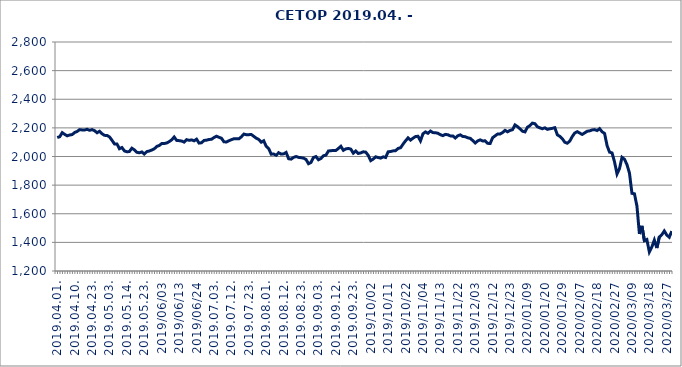
| Category | CETOP |
|---|---|
| 2019.04.01. | 2132.574 |
| 2019.04.02. | 2138.374 |
| 2019.04.03. | 2166.651 |
| 2019.04.04. | 2154.718 |
| 2019.04.05. | 2144.455 |
| 2019.04.08. | 2150.202 |
| 2019.04.09. | 2153.045 |
| 2019.04.10. | 2167.895 |
| 2019.04.11. | 2174.854 |
| 2019.04.12. | 2187.792 |
| 2019.04.15. | 2185.484 |
| 2019.04.16. | 2185.305 |
| 2019.04.17. | 2190.201 |
| 2019.04.18. | 2182.992 |
| 2019.04.23. | 2187.796 |
| 2019.04.24. | 2180.508 |
| 2019.04.25. | 2165.991 |
| 2019.04.26. | 2176.261 |
| 2019.04.29. | 2159.18 |
| 2019.04.30. | 2147.64 |
| 2019.05.02. | 2147.386 |
| 2019.05.03. | 2136.927 |
| 2019.05.06. | 2113.432 |
| 2019.05.07. | 2087.889 |
| 2019.05.08. | 2087.837 |
| 2019.05.09. | 2054.158 |
| 2019.05.10. | 2062.71 |
| 2019.05.13. | 2038.936 |
| 2019.05.14. | 2033.011 |
| 2019.05.15. | 2034.809 |
| 2019.05.16. | 2058.039 |
| 2019.05.17. | 2046.341 |
| 2019.05.20. | 2029.475 |
| 2019.05.21. | 2025.854 |
| 2019.05.22. | 2032.113 |
| 2019.05.23. | 2017.154 |
| 2019.05.24. | 2034.381 |
| 2019.05.27. | 2038.296 |
| 2019.05.28. | 2045.236 |
| 2019.05.29. | 2053.447 |
| 2019.05.30. | 2070.528 |
| 2019.05.31. | 2076.617 |
| 2019.06.03 | 2090.394 |
| 2019.06.04 | 2090.6 |
| 2019.06.05 | 2094.513 |
| 2019.06.06 | 2103.91 |
| 2019.06.07 | 2116.435 |
| 2019.06.11 | 2136.123 |
| 2019.06.12 | 2112.388 |
| 2019.06.13 | 2110.676 |
| 2019.06.14 | 2108.209 |
| 2019.06.17 | 2100.6 |
| 2019.06.18 | 2117.572 |
| 2019.06.19 | 2113.011 |
| 2019.06.20 | 2115.984 |
| 2019.06.21 | 2109.609 |
| 2019.06.24 | 2120.999 |
| 2019.06.25 | 2093.746 |
| 2019.06.26 | 2096.039 |
| 2019.06.27 | 2112.207 |
| 2019.06.28 | 2113.97 |
| 2019.07.01. | 2119.044 |
| 2019.07.02. | 2120.3 |
| 2019.07.03. | 2132.465 |
| 2019.07.04. | 2141.695 |
| 2019.07.05. | 2134.196 |
| 2019.07.08. | 2127.836 |
| 2019.07.09. | 2102.643 |
| 2019.07.10. | 2101.454 |
| 2019.07.11. | 2110.086 |
| 2019.07.12. | 2117.39 |
| 2019.07.15. | 2123.898 |
| 2019.07.16. | 2124.809 |
| 2019.07.17. | 2123.353 |
| 2019.07.18. | 2137.452 |
| 2019.07.19. | 2156.668 |
| 2019.07.22. | 2152.36 |
| 2019.07.23. | 2152.57 |
| 2019.07.24. | 2153.612 |
| 2019.07.25. | 2140.737 |
| 2019.07.26. | 2127.816 |
| 2019.07.29. | 2118.782 |
| 2019.07.30. | 2099.886 |
| 2019.07.31. | 2109.818 |
| 2019.08.01. | 2070.93 |
| 2019.08.02. | 2055.032 |
| 2019.08.05. | 2016.276 |
| 2019.08.06. | 2017.506 |
| 2019.08.07. | 2008.979 |
| 2019.08.08. | 2026.532 |
| 2019.08.09. | 2016.695 |
| 2019.08.12. | 2018.423 |
| 2019.08.13. | 2028.416 |
| 2019.08.14. | 1984.487 |
| 2019.08.15. | 1981.724 |
| 2019.08.16. | 1993.713 |
| 2019.08.21. | 2000.188 |
| 2019.08.22. | 1993.951 |
| 2019.08.23. | 1991.843 |
| 2019.08.26. | 1988.713 |
| 2019.08.27. | 1979.26 |
| 2019.08.28. | 1949.461 |
| 2019.08.29. | 1958.413 |
| 2019.08.30. | 1993.113 |
| 2019.09.02. | 1999.57 |
| 2019.09.03. | 1977.184 |
| 2019.09.04. | 1986.239 |
| 2019.09.05. | 2005.325 |
| 2019.09.06. | 2009.588 |
| 2019.09.09. | 2038.644 |
| 2019.09.10. | 2040.218 |
| 2019.09.11. | 2042.754 |
| 2019.09.12. | 2042.339 |
| 2019.09.13. | 2056.076 |
| 2019.09.16. | 2071.224 |
| 2019.09.17. | 2043.022 |
| 2019.09.18. | 2053.353 |
| 2019.09.19. | 2056.136 |
| 2019.09.20. | 2051.549 |
| 2019.09.23. | 2023.377 |
| 2019.09.24. | 2038.404 |
| 2019.09.25. | 2021.298 |
| 2019.09.26. | 2025.245 |
| 2019.09.27. | 2032.833 |
| 2019.09.30. | 2030.463 |
| 2019.10.01 | 2008.057 |
| 2019.10.02 | 1971.078 |
| 2019.10.03 | 1981.991 |
| 2019.10.04 | 1997.58 |
| 2019.10.07 | 1992.692 |
| 2019.10.08 | 1988.823 |
| 2019.10.09 | 1997.733 |
| 2019.10.10 | 1992.922 |
| 2019.10.11 | 2032.773 |
| 2019.10.14 | 2034.801 |
| 2019.10.15 | 2039.197 |
| 2019.10.16 | 2040.819 |
| 2019.10.17 | 2056.4 |
| 2019.10.18 | 2061.182 |
| 2019.10.21 | 2086.559 |
| 2019.10.22 | 2109.527 |
| 2019.10.24 | 2130.228 |
| 2019.10.25 | 2114.565 |
| 2019.10.28 | 2128.02 |
| 2019.10.29 | 2139.266 |
| 2019.10.30 | 2141.575 |
| 2019.10.31 | 2109.221 |
| 2019.11.04 | 2158.943 |
| 2019.11.05 | 2171.721 |
| 2019.11.06 | 2162.076 |
| 2019.11.07 | 2177.859 |
| 2019.11.08 | 2166.914 |
| 2019.11.11 | 2166.351 |
| 2019.11.12 | 2162.246 |
| 2019.11.13 | 2152.526 |
| 2019.11.14 | 2145.406 |
| 2019.11.15 | 2154.38 |
| 2019.11.18 | 2151.842 |
| 2019.11.19 | 2143.897 |
| 2019.11.20 | 2143.72 |
| 2019.11.21 | 2129.171 |
| 2019.11.22 | 2144.785 |
| 2019.11.25 | 2151.26 |
| 2019.11.26 | 2139.775 |
| 2019.11.27 | 2138.399 |
| 2019.11.28 | 2130.715 |
| 2019.11.29 | 2126.888 |
| 2019.12.02 | 2111.466 |
| 2019.12.03 | 2094.329 |
| 2019.12.04 | 2108.783 |
| 2019.12.05 | 2116.282 |
| 2019.12.06 | 2108.479 |
| 2019.12.09 | 2109.66 |
| 2019.12.10 | 2092.128 |
| 2019.12.11 | 2090.651 |
| 2019.12.12 | 2131.384 |
| 2019.12.13 | 2144.433 |
| 2019.12.16 | 2157.013 |
| 2019.12.17 | 2157.349 |
| 2019.12.18 | 2167.456 |
| 2019.12.19 | 2182.798 |
| 2019.12.20 | 2172.566 |
| 2019.12.23 | 2182.302 |
| 2019.12.30 | 2187.487 |
| 2020.01.02 | 2220.63 |
| 2020.01.03 | 2208.668 |
| 2020.01.06 | 2193.348 |
| 2020.01.07 | 2176.556 |
| 2020.01.08 | 2171.887 |
| 2020.01.09 | 2204.85 |
| 2020.01.10 | 2215.374 |
| 2020.01.13 | 2233.13 |
| 2020.01.14 | 2229.256 |
| 2020.01.15 | 2207.656 |
| 2020.01.16 | 2200.151 |
| 2020.01.17 | 2194.058 |
| 2020.01.20 | 2200.573 |
| 2020.01.21 | 2189.542 |
| 2020.01.22 | 2193.817 |
| 2020.01.23 | 2196.866 |
| 2020.01.24 | 2201.484 |
| 2020.01.27 | 2151.661 |
| 2020.01.28 | 2140.75 |
| 2020.01.29 | 2124.453 |
| 2020.01.30 | 2099.625 |
| 2020.01.31 | 2092.804 |
| 2020.02.03 | 2107.238 |
| 2020.02.04 | 2139.224 |
| 2020.02.05 | 2163.858 |
| 2020.02.06 | 2173.552 |
| 2020.02.07 | 2163.761 |
| 2020.02.10 | 2154.132 |
| 2020.02.11 | 2165.065 |
| 2020.02.12 | 2176.466 |
| 2020.02.13 | 2179.004 |
| 2020.02.14 | 2185.728 |
| 2020.02.17 | 2187.841 |
| 2020.02.18 | 2181.45 |
| 2020.02.19 | 2194.615 |
| 2020.02.20 | 2172.959 |
| 2020.02.21 | 2160.832 |
| 2020.02.24 | 2076.247 |
| 2020.02.25 | 2030.311 |
| 2020.02.26 | 2024.968 |
| 2020.02.27 | 1962.205 |
| 2020.02.28 | 1877.913 |
| 2020.03.02 | 1915.812 |
| 2020.03.03 | 1994.418 |
| 2020.03.04 | 1980.79 |
| 2020.03.05 | 1942.986 |
| 2020.03.06 | 1884.333 |
| 2020.03.09 | 1742.838 |
| 2020.03.10 | 1739.523 |
| 2020.03.11 | 1654.414 |
| 2020.03.12 | 1458.928 |
| 2020.03.13 | 1515.225 |
| 2020.03.16 | 1411.769 |
| 2020.03.17 | 1419.91 |
| 2020.03.18 | 1332.932 |
| 2020.03.19 | 1368.187 |
| 2020.03.20 | 1416.41 |
| 2020.03.23 | 1360.369 |
| 2020.03.24 | 1437.401 |
| 2020.03.25 | 1453.309 |
| 2020.03.26 | 1479.751 |
| 2020.03.27 | 1451.143 |
| 2020.03.30 | 1436.146 |
| 2020.03.31 | 1478.335 |